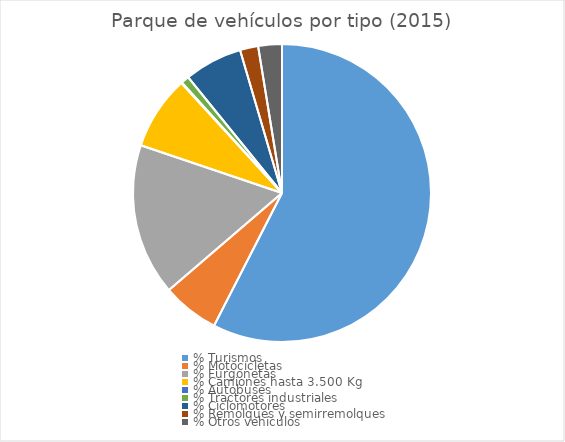
| Category | Series 0 |
|---|---|
| % Turismos | 0.575 |
| % Motocicletas | 0.062 |
| % Furgonetas | 0.165 |
| % Camiones hasta 3.500 Kg | 0.08 |
| % Autobuses | 0.001 |
| % Tractores industriales | 0.009 |
| % Ciclomotores | 0.063 |
| % Remolques y semirremolques | 0.02 |
| % Otros vehículos | 0.026 |